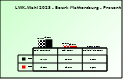
| Category | 2018 | 2023 |
|---|---|---|
| Bgld. Bauernbund | 0.714 | 0.792 |
| SPÖ Bauern | 0.25 | 0.191 |
| Freiheitliche Bauern | 0.035 | 0.017 |